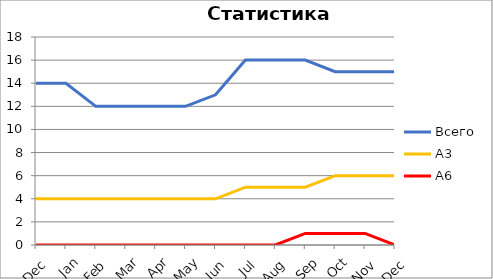
| Category | Всего | А3 | A6 |
|---|---|---|---|
| 0 | 14 | 4 | 0 |
| 1 | 14 | 4 | 0 |
| 2 | 12 | 4 | 0 |
| 3 | 12 | 4 | 0 |
| 4 | 12 | 4 | 0 |
| 5 | 12 | 4 | 0 |
| 6 | 13 | 4 | 0 |
| 7 | 16 | 5 | 0 |
| 8 | 16 | 5 | 0 |
| 9 | 16 | 5 | 1 |
| 10 | 15 | 6 | 1 |
| 11 | 15 | 6 | 1 |
| 12 | 15 | 6 | 0 |